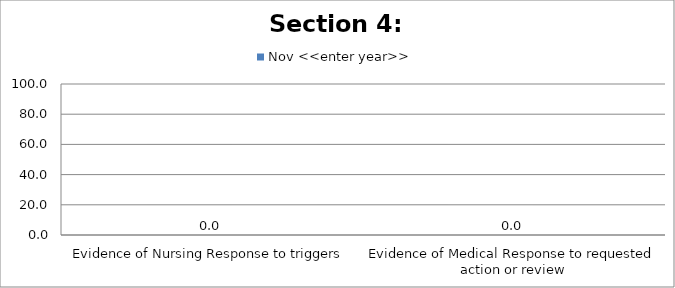
| Category | Nov <<enter year>> |
|---|---|
| Evidence of Nursing Response to triggers | 0 |
| Evidence of Medical Response to requested action or review | 0 |